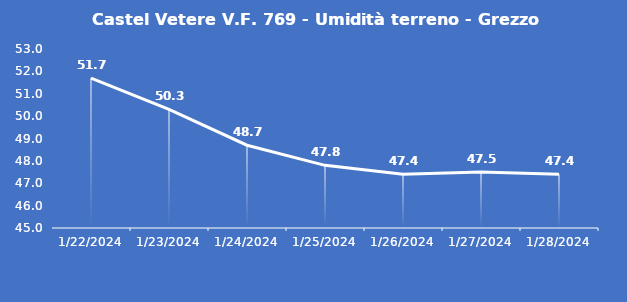
| Category | Castel Vetere V.F. 769 - Umidità terreno - Grezzo (%VWC) |
|---|---|
| 1/22/24 | 51.7 |
| 1/23/24 | 50.3 |
| 1/24/24 | 48.7 |
| 1/25/24 | 47.8 |
| 1/26/24 | 47.4 |
| 1/27/24 | 47.5 |
| 1/28/24 | 47.4 |